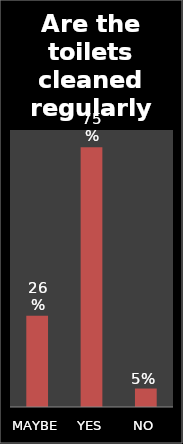
| Category | Series 0 |
|---|---|
| MAYBE | 0.263 |
| YES | 0.75 |
| NO | 0.053 |